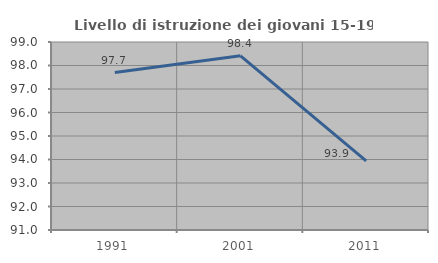
| Category | Livello di istruzione dei giovani 15-19 anni |
|---|---|
| 1991.0 | 97.701 |
| 2001.0 | 98.413 |
| 2011.0 | 93.939 |